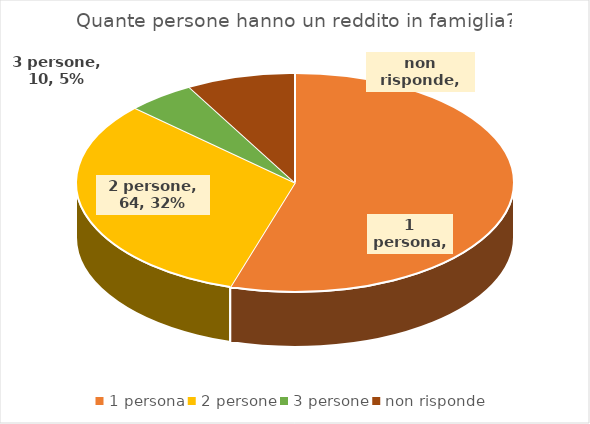
| Category | Series 0 |
|---|---|
| 1 persona | 109 |
| 2 persone | 64 |
| 3 persone | 10 |
| non risponde | 16 |